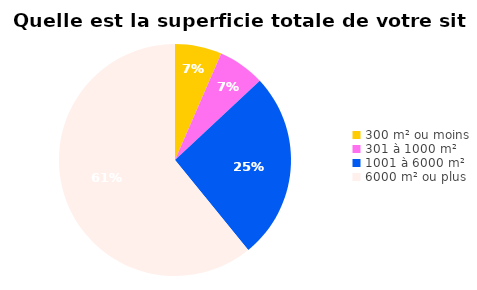
| Category | Series 0 |
|---|---|
| 300 m² ou moins | 3 |
| 301 à 1000 m² | 3 |
| 1001 à 6000 m² | 12 |
| 6000 m² ou plus | 28 |